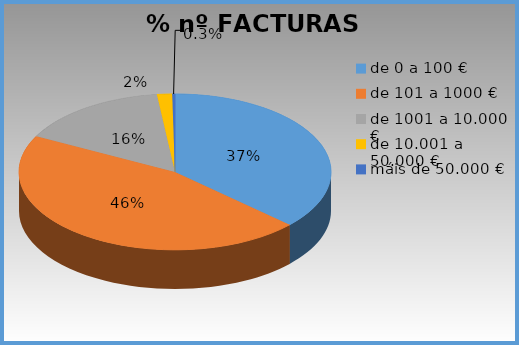
| Category | Series 0 |
|---|---|
| de 0 a 100 € | 0.369 |
| de 101 a 1000 € | 0.457 |
| de 1001 a 10.000 € | 0.156 |
| de 10.001 a 50.000 € | 0.016 |
| máis de 50.000 € | 0.003 |